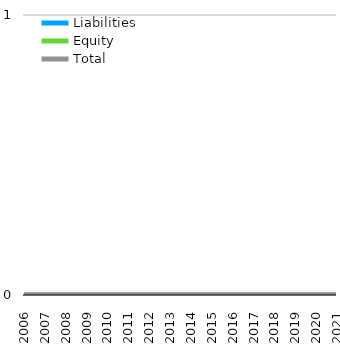
| Category | Liabilities  | Equity  | Total |
|---|---|---|---|
| 2006 | 0 | 0 | 0 |
| 2007 | 0 | 0 | 0 |
| 2008 | 0 | 0 | 0 |
| 2009 | 0 | 0 | 0 |
| 2010 | 0 | 0 | 0 |
| 2011 | 0 | 0 | 0 |
| 2012 | 0 | 0 | 0 |
| 2013 | 0 | 0 | 0 |
| 2014 | 0 | 0 | 0 |
| 2015 | 0 | 0 | 0 |
| 2016 | 0 | 0 | 0 |
| 2017 | 0 | 0 | 0 |
| 2018 | 0 | 0 | 0 |
| 2019 | 0 | 0 | 0 |
| 2020 | 0 | 0 | 0 |
| 2021 | 0 | 0 | 0 |